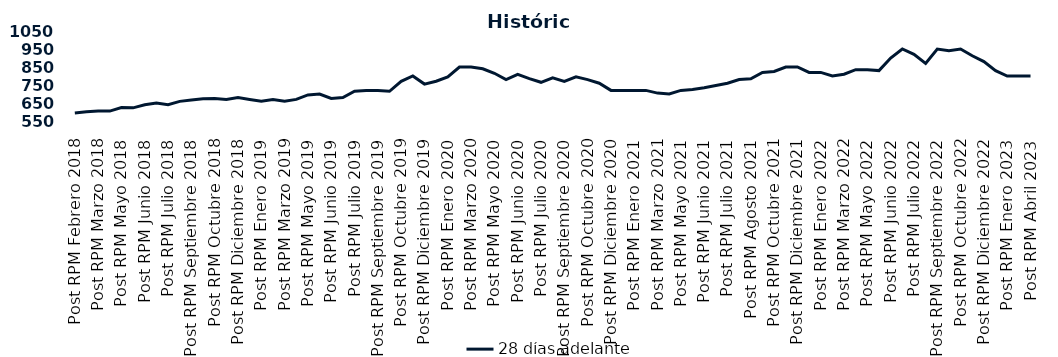
| Category | 28 días adelante |
|---|---|
| Post RPM Febrero 2018 | 595 |
| Pre RPM Marzo 2018 | 601 |
| Post RPM Marzo 2018 | 605 |
| Pre RPM Mayo 2018 | 605 |
| Post RPM Mayo 2018 | 625 |
| Pre RPM Junio 2018 | 623 |
| Post RPM Junio 2018 | 640 |
| Pre RPM Julio 2018 | 650 |
| Post RPM Julio 2018 | 641 |
| Pre RPM Septiembre 2018 | 659 |
| Post RPM Septiembre 2018 | 666.75 |
| Pre RPM Octubre 2018 | 674 |
| Post RPM Octubre 2018 | 675 |
| Pre RPM Diciembre 2018 | 670 |
| Post RPM Diciembre 2018 | 680 |
| Pre RPM Enero 2019 | 670 |
| Post RPM Enero 2019 | 660 |
| Pre RPM Marzo 2019 | 670 |
| Post RPM Marzo 2019 | 660 |
| Pre RPM Mayo 2019 | 670 |
| Post RPM Mayo 2019 | 695 |
| Pre RPM Junio 2019 | 700 |
| Post RPM Junio 2019 | 675 |
| Pre RPM Julio 2019 | 680 |
| Post RPM Julio 2019 | 715 |
| Pre RPM Septiembre 2019 | 720 |
| Post RPM Septiembre 2019 | 720 |
| Pre RPM Octubre 2019 | 715 |
| Post RPM Octubre 2019 | 770 |
| Pre RPM Diciembre 2019 | 800 |
| Post RPM Diciembre 2019 | 755 |
| Pre RPM Enero 2020 | 771 |
| Post RPM Enero 2020 | 795 |
| Pre RPM Marzo 2020 | 850 |
| Post RPM Marzo 2020 | 850 |
| Pre RPM Mayo 2020 | 840 |
| Post RPM Mayo 2020 | 815 |
| Pre RPM Junio 2020 | 780 |
| Post RPM Junio 2020 | 809 |
| Pre RPM Julio 2020 | 785.72 |
| Post RPM Julio 2020 | 765 |
| Pre RPM Septiembre 2020 | 790 |
| Post RPM Septiembre 2020 | 770 |
| Pre RPM Octubre 2020 | 795 |
| Post RPM Octubre 2020 | 780 |
| Pre RPM Diciembre 2020 | 760 |
| Post RPM Diciembre 2020 | 720 |
| Pre RPM Enero 2021 | 720 |
| Post RPM Enero 2021 | 720 |
| Pre RPM Marzo 2021 | 720 |
| Post RPM Marzo 2021 | 705 |
| Pre RPM Mayo 2021 | 700 |
| Post RPM Mayo 2021 | 720 |
| Pre RPM Junio 2021 | 725 |
| Post RPM Junio 2021 | 735 |
| Pre RPM Julio 2021 | 747.5 |
| Post RPM Julio 2021 | 760 |
| Pre RPM Agosto 2021 | 780 |
| Post RPM Agosto 2021 | 785 |
| Pre RPM Octubre 2021 | 820 |
| Post RPM Octubre 2021 | 825 |
| Pre RPM Diciembre 2021 | 850 |
| Post RPM Diciembre 2021 | 850 |
| Pre RPM Enero 2022 | 820 |
| Post RPM Enero 2022 | 820 |
| Pre RPM Marzo 2022 | 800 |
| Post RPM Marzo 2022 | 810 |
| Pre RPM Mayo 2022 | 835 |
| Post RPM Mayo 2022 | 835 |
| Pre RPM Junio 2022 | 830 |
| Post RPM Junio 2022 | 900 |
| Pre RPM Julio 2022 | 950 |
| Post RPM Julio 2022 | 920 |
| Pre RPM Septiembre 2022 | 870 |
| Post RPM Septiembre 2022 | 950 |
| Pre RPM Octubre 2022 | 940 |
| Post RPM Octubre 2022 | 950 |
| Pre RPM Diciembre 2022 | 912.5 |
| Post RPM Diciembre 2022 | 880 |
| Pre RPM Enero 2023 | 830 |
| Post RPM Enero 2023 | 800 |
| Pre RPM Abril 2023 | 800 |
| Post RPM Abril 2023 | 800 |